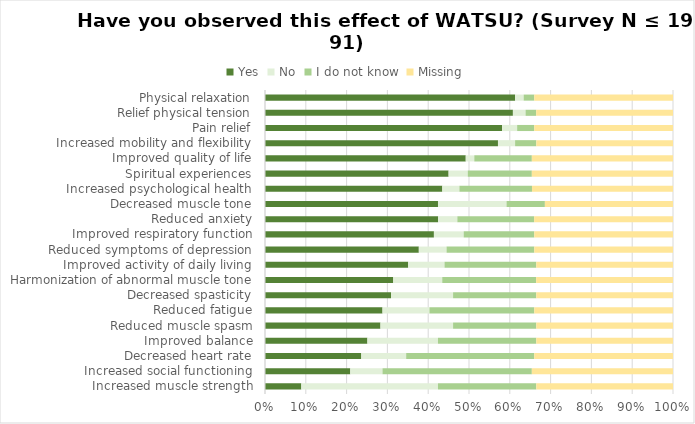
| Category | Yes | No | I do not know | Missing |
|---|---|---|---|---|
| Physical relaxation | 61.3 | 2.1 | 2.6 | 34 |
| Relief physical tension | 60.7 | 3.1 | 2.6 | 33.5 |
| Pain relief | 58.1 | 3.7 | 4.2 | 34 |
| Increased mobility and flexibility | 57.1 | 4.2 | 5.2 | 33.5 |
| Improved quality of life | 49.2 | 2.1 | 14.1 | 34.6 |
| Spiritual experiences | 45 | 4.7 | 15.7 | 34.6 |
| Increased psychological health | 43.5 | 4.2 | 17.8 | 34.6 |
| Decreased muscle tone | 42.4 | 16.8 | 9.4 | 31.4 |
| Reduced anxiety | 42.4 | 4.7 | 18.8 | 34 |
| Improved respiratory function | 41.4 | 7.3 | 17.3 | 34 |
| Reduced symptoms of depression | 37.7 | 6.8 | 21.5 | 34 |
| Improved activity of daily living | 35.1 | 8.9 | 22.5 | 33.5 |
| Harmonization of abnormal muscle tone | 31.4 | 12 | 23 | 33.5 |
| Decreased spasticity | 30.9 | 15.2 | 20.4 | 33.5 |
| Reduced fatigue | 28.8 | 11.5 | 25.7 | 34 |
| Reduced muscle spasm | 28.3 | 17.8 | 20.4 | 33.5 |
| Improved balance | 25.1 | 17.3 | 24.1 | 33.5 |
| Decreased heart rate | 23.6 | 11 | 31.4 | 34 |
| Increased social functioning | 20.9 | 7.9 | 36.6 | 34.6 |
| Increased muscle strength | 8.9 | 33.5 | 24.1 | 33.5 |